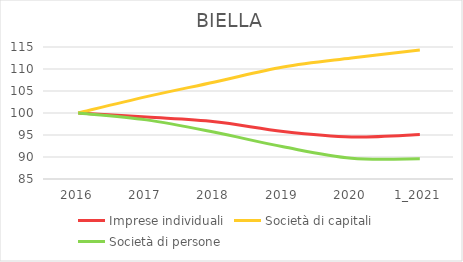
| Category | Imprese individuali | Società di capitali | Società di persone |
|---|---|---|---|
| 2016 | 100 | 100 | 100 |
| 2017 | 99.069 | 103.719 | 98.441 |
| 2018 | 98.026 | 107.052 | 95.613 |
| 2019 | 95.81 | 110.461 | 92.31 |
| 2020 | 94.562 | 112.515 | 89.72 |
| 1_2021 | 95.121 | 114.297 | 89.614 |